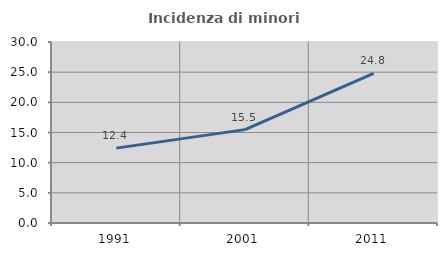
| Category | Incidenza di minori stranieri |
|---|---|
| 1991.0 | 12.409 |
| 2001.0 | 15.474 |
| 2011.0 | 24.794 |